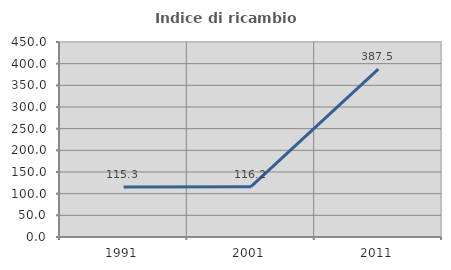
| Category | Indice di ricambio occupazionale  |
|---|---|
| 1991.0 | 115.254 |
| 2001.0 | 116.216 |
| 2011.0 | 387.5 |